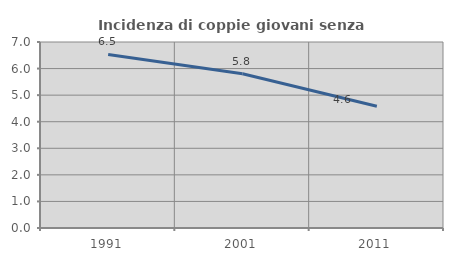
| Category | Incidenza di coppie giovani senza figli |
|---|---|
| 1991.0 | 6.534 |
| 2001.0 | 5.804 |
| 2011.0 | 4.583 |